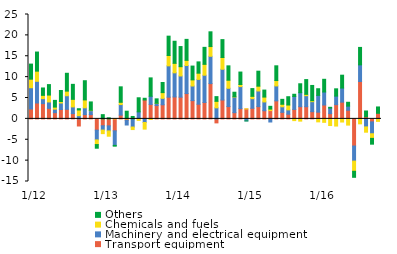
| Category | Transport equipment | Machinery and electrical equipment | Chemicals and fuels | Others |
|---|---|---|---|---|
|   1/12 | 2.375 | 5.087 | 2.049 | 3.61 |
| 2 | 3.8 | 5.198 | 2.432 | 4.578 |
| 3 | 3.654 | 1.192 | 0.784 | 1.771 |
| 4 | 2.526 | 1.529 | 1.647 | 2.507 |
| 5 | 1.491 | 0.841 | 0.489 | 1.607 |
| 6 | 2.248 | 1.555 | 0.359 | 2.631 |
| 7 | 2.293 | 3.251 | 1.104 | 4.275 |
| 8 | 1.264 | 1.601 | 1.813 | 3.592 |
| 9 | -1.704 | 0.774 | 1.363 | 0.297 |
| 10 | 1.029 | 1.623 | 1.888 | 4.599 |
| 11 | 1.022 | 0.949 | 0.084 | 2.004 |
| 12 | -2.702 | -2.336 | -1.116 | -0.873 |
|   1/13 | -1.654 | -1.031 | -0.854 | 1.012 |
| 2 | -1.679 | -1.203 | -1.271 | 0.259 |
| 3 | -2.864 | -3.483 | 0.024 | -0.191 |
| 4 | 0.901 | 2.527 | 0.54 | 3.706 |
| 5 | -0.344 | -1.125 | 0.115 | 1.722 |
| 6 | 0.032 | -1.953 | -0.604 | 0.546 |
| 7 | 0.103 | 1.582 | -0.362 | 3.367 |
| 8 | 4.521 | -0.874 | -1.581 | 0.412 |
| 9 | 3.47 | 1.943 | -0.144 | 4.403 |
| 10 | 3.184 | 0.524 | 0.03 | 1.057 |
| 11 | 3.377 | 1.544 | 1.368 | 2.422 |
| 12 | 5.195 | 7.51 | 2.479 | 4.628 |
|   1/14 | 5.256 | 5.777 | 2.267 | 5.293 |
| 2 | 5.202 | 5.08 | 2.218 | 4.822 |
| 3 | 6.06 | 6.73 | 1.229 | 5.024 |
| 4 | 4.378 | 3.497 | 1.471 | 3.302 |
| 5 | 3.509 | 5.948 | 1.485 | 2.707 |
| 6 | 3.934 | 6.525 | 2.604 | 4.069 |
| 7 | 8.451 | 6.546 | 2.328 | 3.528 |
| 8 | -0.958 | 2.644 | 1.557 | 1.127 |
| 9 | 4.517 | 7.371 | 2.809 | 4.289 |
| 10 | 2.945 | 4.382 | 1.934 | 3.44 |
| 11 | 1.485 | 3.75 | 0.071 | 1.076 |
| 12 | 2.456 | 5.276 | 0.504 | 2.98 |
|   1/15 | 2.368 | -0.485 | 0.029 | -0.004 |
| 2 | 2.54 | 2.298 | 0.56 | 1.855 |
| 3 | 2.935 | 3.749 | 1.148 | 3.589 |
| 4 | 1.953 | 2.107 | 1.162 | 1.675 |
| 5 | 1.985 | -0.746 | 0.357 | 0.666 |
| 6 | 4.317 | 3.577 | 1.287 | 3.528 |
| 7 | 1.561 | 1.329 | 0.608 | 1.181 |
| 8 | 1.121 | 1.031 | 1.168 | 1.987 |
| 9 | 2.261 | 3.095 | -0.417 | 0.537 |
| 10 | 2.923 | 3.349 | -0.539 | 2.136 |
| 11 | 2.917 | 2.646 | 0.308 | 3.54 |
| 12 | 1.723 | 2.401 | 0.224 | 3.656 |
|   1/16 | 1.605 | 4.018 | -0.716 | 1.598 |
| 2 | 3.325 | 3.111 | -0.829 | 3.044 |
| 3 | 1.248 | 1.34 | -1.595 | 0.18 |
| 4 | 3.409 | 2.045 | -1.718 | 1.744 |
| 5 | 4.008 | 3.369 | -0.756 | 3.086 |
| 6 | 2.071 | 0.98 | -1.49 | 0.926 |
| 7 | -6.506 | -3.614 | -2.433 | -1.444 |
| 8 | 8.949 | 3.988 | -1.191 | 4.178 |
| 9 | 0.506 | -1.925 | -1.267 | 1.383 |
| 10 | -0.726 | -2.839 | -1.107 | -1.387 |
| 11 | 1.334 | -0.16 | -0.444 | 1.521 |